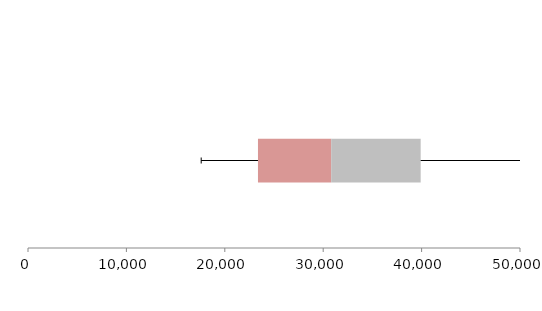
| Category | Series 1 | Series 2 | Series 3 |
|---|---|---|---|
| 0 | 23371.439 | 7442.496 | 9091.824 |